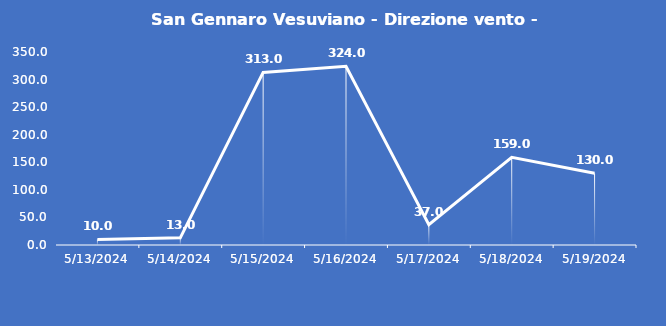
| Category | San Gennaro Vesuviano - Direzione vento - Grezzo (°N) |
|---|---|
| 5/13/24 | 10 |
| 5/14/24 | 13 |
| 5/15/24 | 313 |
| 5/16/24 | 324 |
| 5/17/24 | 37 |
| 5/18/24 | 159 |
| 5/19/24 | 130 |